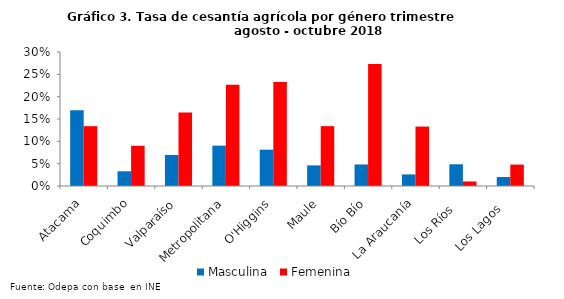
| Category | Masculina | Femenina |
|---|---|---|
| Atacama | 0.169 | 0.134 |
| Coquimbo | 0.033 | 0.09 |
| Valparaíso | 0.07 | 0.165 |
| Metropolitana | 0.09 | 0.227 |
| O'Higgins | 0.081 | 0.233 |
| Maule | 0.046 | 0.134 |
| Bío Bío | 0.048 | 0.273 |
| La Araucanía | 0.026 | 0.133 |
| Los Ríos   | 0.049 | 0.01 |
| Los Lagos   | 0.02 | 0.048 |